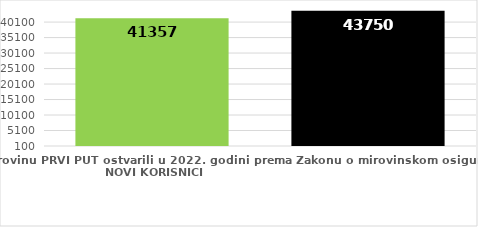
| Category | broj korisnika |
|---|---|
| Korisnici koji su pravo na mirovinu PRVI PUT ostvarili u 2022. godini prema Zakonu o mirovinskom osiguranju - NOVI KORISNICI | 41357 |
| Korisnici mirovina kojima je u 2022. godini PRESTALO PRAVO NA MIROVINU - uzrok smrt 
koji su pravo na mirovinu ostvarili prema Zakonu o mirovinskom osiguranju | 43750 |